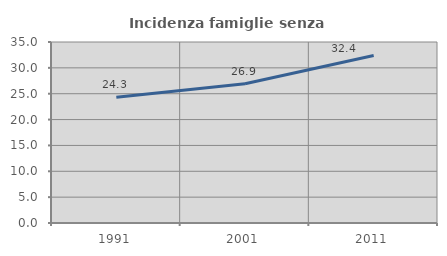
| Category | Incidenza famiglie senza nuclei |
|---|---|
| 1991.0 | 24.305 |
| 2001.0 | 26.94 |
| 2011.0 | 32.383 |